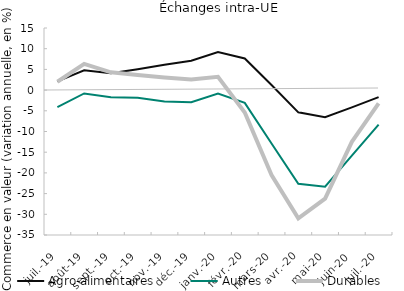
| Category | Agro-alimentaires | Autres | Durables |
|---|---|---|---|
| 2019-07-01 | 2.111 | -4.112 | 2.026 |
| 2019-08-01 | 4.771 | -0.811 | 6.323 |
| 2019-09-01 | 4.054 | -1.742 | 4.285 |
| 2019-10-01 | 5.03 | -1.874 | 3.654 |
| 2019-11-01 | 6.096 | -2.758 | 3.039 |
| 2019-12-01 | 7.072 | -2.952 | 2.565 |
| 2020-01-01 | 9.172 | -0.811 | 3.22 |
| 2020-02-01 | 7.65 | -3.088 | -5.427 |
| 2020-03-01 | 1.248 | -12.901 | -20.542 |
| 2020-04-01 | -5.376 | -22.626 | -30.976 |
| 2020-05-01 | -6.525 | -23.337 | -26.219 |
| 2020-06-01 | -4.159 | -15.819 | -12.505 |
| 2020-07-01 | -1.683 | -8.333 | -3.196 |